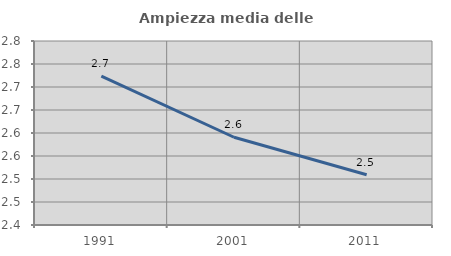
| Category | Ampiezza media delle famiglie |
|---|---|
| 1991.0 | 2.724 |
| 2001.0 | 2.591 |
| 2011.0 | 2.509 |